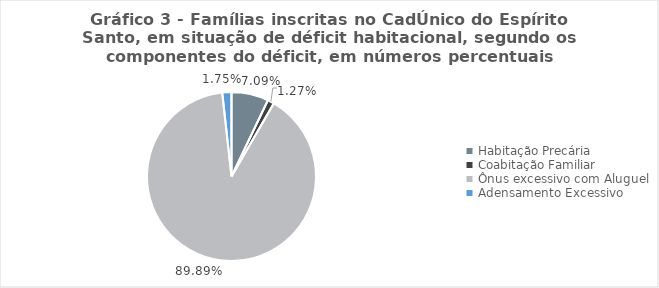
| Category | Series 0 | Series 1 |
|---|---|---|
| Habitação Precária | 5277 | 0.071 |
| Coabitação Familiar | 942 | 0.013 |
| Ônus excessivo com Aluguel | 66929 | 0.899 |
| Adensamento Excessivo | 1306 | 0.018 |